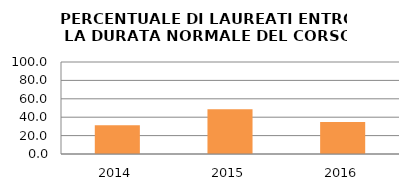
| Category | 2014 2015 2016 |
|---|---|
| 2014.0 | 31.25 |
| 2015.0 | 48.718 |
| 2016.0 | 34.884 |